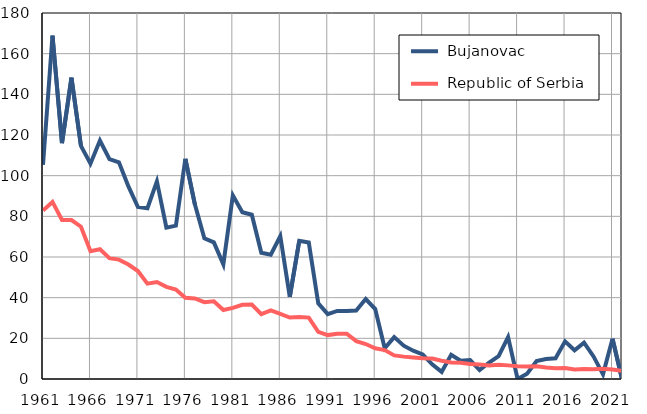
| Category |  Bujanovac |  Republic of Serbia |
|---|---|---|
| 1961.0 | 105.3 | 82.9 |
| 1962.0 | 168.9 | 87.1 |
| 1963.0 | 116 | 78.2 |
| 1964.0 | 148.2 | 78.2 |
| 1965.0 | 114.6 | 74.9 |
| 1966.0 | 105.9 | 62.8 |
| 1967.0 | 117.3 | 63.8 |
| 1968.0 | 108.1 | 59.4 |
| 1969.0 | 106.6 | 58.7 |
| 1970.0 | 94.7 | 56.3 |
| 1971.0 | 84.6 | 53.1 |
| 1972.0 | 84 | 46.9 |
| 1973.0 | 97.2 | 47.7 |
| 1974.0 | 74.4 | 45.3 |
| 1975.0 | 75.4 | 44 |
| 1976.0 | 108.3 | 39.9 |
| 1977.0 | 85.9 | 39.6 |
| 1978.0 | 69.2 | 37.8 |
| 1979.0 | 67.2 | 38.2 |
| 1980.0 | 56.4 | 33.9 |
| 1981.0 | 90.3 | 35 |
| 1982.0 | 82 | 36.5 |
| 1983.0 | 80.8 | 36.6 |
| 1984.0 | 62.1 | 31.9 |
| 1985.0 | 61.1 | 33.7 |
| 1986.0 | 70.3 | 32 |
| 1987.0 | 40.4 | 30.2 |
| 1988.0 | 68 | 30.5 |
| 1989.0 | 67.1 | 30.2 |
| 1990.0 | 37.2 | 23.2 |
| 1991.0 | 31.9 | 21.6 |
| 1992.0 | 33.5 | 22.3 |
| 1993.0 | 33.5 | 22.3 |
| 1994.0 | 33.7 | 18.6 |
| 1995.0 | 39.3 | 17.2 |
| 1996.0 | 34.4 | 15.1 |
| 1997.0 | 15.1 | 14.2 |
| 1998.0 | 20.6 | 11.6 |
| 1999.0 | 16.4 | 11 |
| 2000.0 | 13.9 | 10.6 |
| 2001.0 | 12.1 | 10.2 |
| 2002.0 | 7.2 | 10.1 |
| 2003.0 | 3.5 | 9 |
| 2004.0 | 11.9 | 8.1 |
| 2005.0 | 9 | 8 |
| 2006.0 | 9.3 | 7.4 |
| 2007.0 | 4.4 | 7.1 |
| 2008.0 | 8.1 | 6.7 |
| 2009.0 | 11.2 | 7 |
| 2010.0 | 20.6 | 6.7 |
| 2011.0 | 0 | 6.3 |
| 2012.0 | 2.6 | 6.2 |
| 2013.0 | 8.8 | 6.3 |
| 2014.0 | 9.8 | 5.7 |
| 2015.0 | 10.2 | 5.3 |
| 2016.0 | 18.5 | 5.4 |
| 2017.0 | 14.1 | 4.7 |
| 2018.0 | 17.9 | 4.9 |
| 2019.0 | 11.1 | 4.8 |
| 2020.0 | 2.3 | 5 |
| 2021.0 | 19.8 | 4.7 |
| 2022.0 | 0 | 4 |